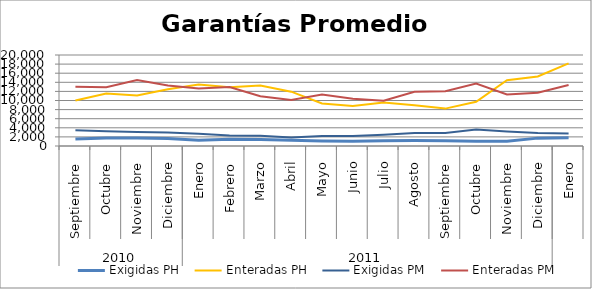
| Category | Exigidas PH | Enteradas PH | Exigidas PM | Enteradas PM |
|---|---|---|---|---|
| 0 | 1528.048 | 9989.528 | 3482.397 | 13040.893 |
| 1 | 1765.671 | 11522.563 | 3249.678 | 12931.878 |
| 2 | 1744.818 | 11123.372 | 3083.204 | 14519.409 |
| 3 | 1659.203 | 12493.623 | 2971.808 | 13273.812 |
| 4 | 1282.931 | 13511.197 | 2715.795 | 12631.271 |
| 5 | 1469.886 | 12912.935 | 2313.398 | 12967.84 |
| 6 | 1451.049 | 13292.147 | 2234.5 | 10944.124 |
| 7 | 1243.266 | 11940.059 | 1876.192 | 10106.188 |
| 8 | 1094.477 | 9346.935 | 2211.516 | 11309.35 |
| 9 | 1038.181 | 8772.488 | 2185.859 | 10360.845 |
| 10 | 1150.33 | 9583.522 | 2484.933 | 9954.534 |
| 11 | 1204.945 | 8947.225 | 2874.347 | 11912.953 |
| 12 | 1181.135 | 8218.837 | 2868.226 | 12046.458 |
| 13 | 1047.181 | 9725.758 | 3619.145 | 13704.352 |
| 14 | 1067.214 | 14456.861 | 3177.175 | 11327.495 |
| 15 | 1729.716 | 15271.717 | 2830.669 | 11719.895 |
| 16 | 1828.564 | 18155.583 | 2744.93 | 13413.991 |